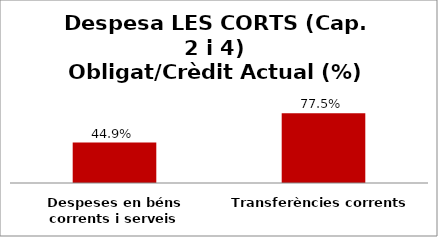
| Category | Series 0 |
|---|---|
| Despeses en béns corrents i serveis | 0.449 |
| Transferències corrents | 0.775 |